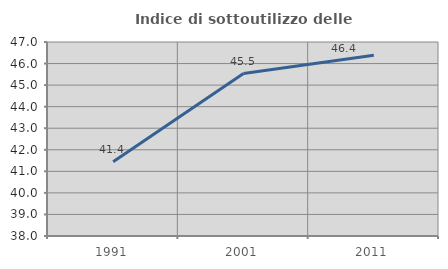
| Category | Indice di sottoutilizzo delle abitazioni  |
|---|---|
| 1991.0 | 41.445 |
| 2001.0 | 45.536 |
| 2011.0 | 46.386 |